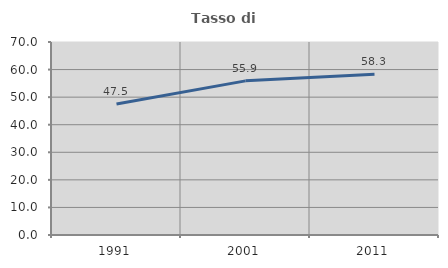
| Category | Tasso di occupazione   |
|---|---|
| 1991.0 | 47.503 |
| 2001.0 | 55.903 |
| 2011.0 | 58.269 |